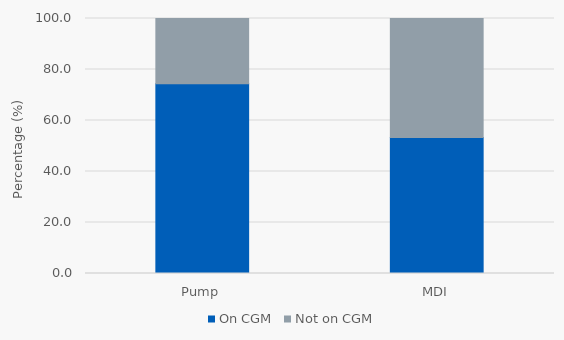
| Category | On CGM | Not on CGM |
|---|---|---|
| Pump | 74.396 | 25.604 |
| MDI | 53.3 | 46.7 |